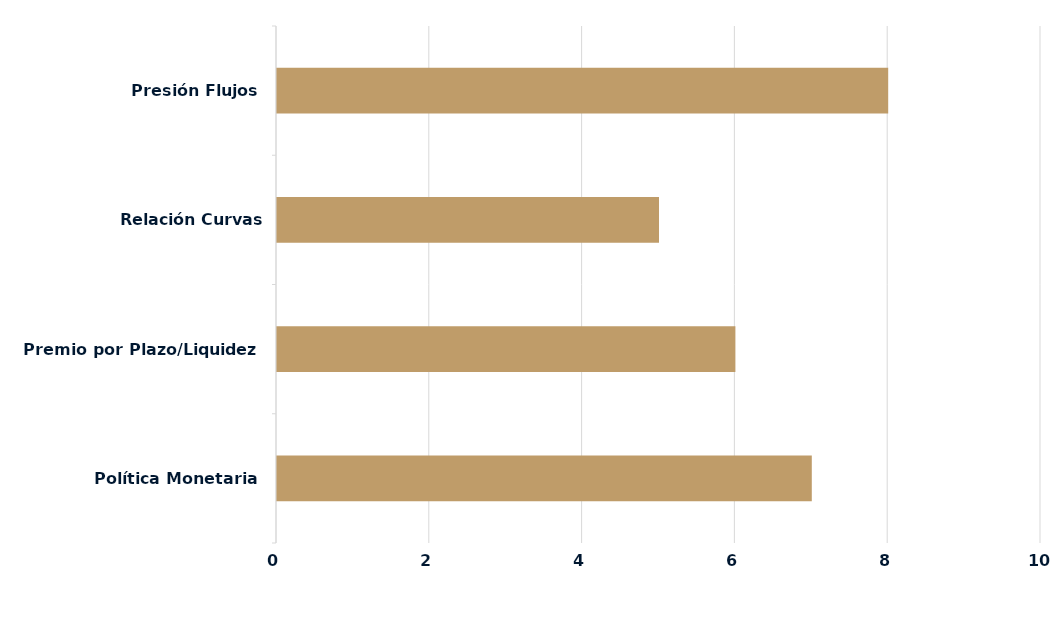
| Category | Series 0 |
|---|---|
| Política Monetaria | 7 |
| Premio por Plazo/Liquidez | 6 |
| Relación Curvas Internacionales | 5 |
| Presión Flujos | 8 |